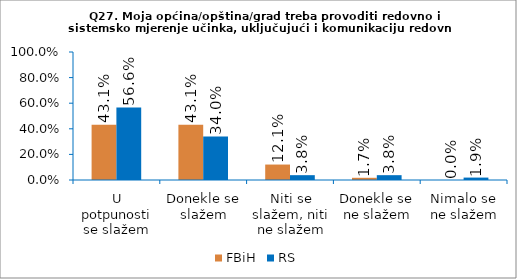
| Category | FBiH | RS |
|---|---|---|
| U potpunosti se slažem | 0.431 | 0.566 |
| Donekle se slažem | 0.431 | 0.34 |
| Niti se slažem, niti ne slažem | 0.121 | 0.038 |
| Donekle se ne slažem | 0.017 | 0.038 |
| Nimalo se ne slažem | 0 | 0.019 |